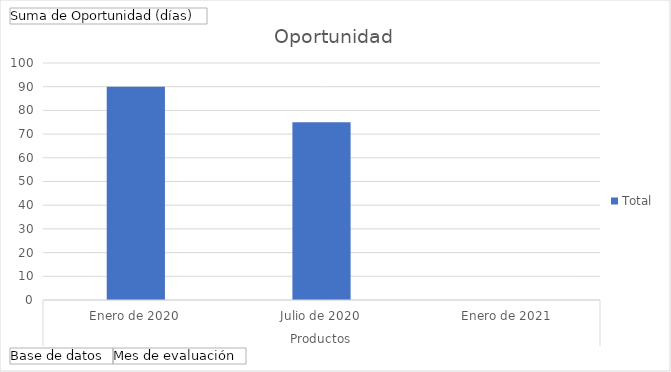
| Category | Total |
|---|---|
| 0 | 90 |
| 1 | 75 |
| 2 | 0 |